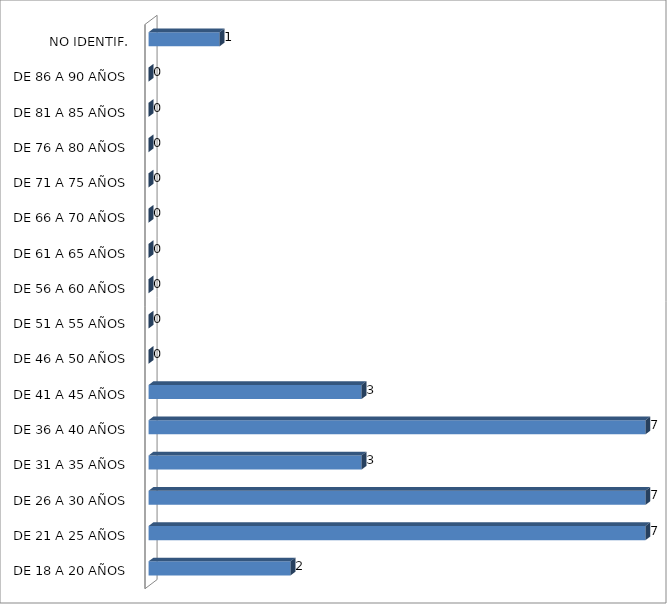
| Category | ESTADO  DE EBRIEDAD |
|---|---|
| DE 18 A 20 AÑOS | 2 |
| DE 21 A 25 AÑOS | 7 |
| DE 26 A 30 AÑOS | 7 |
| DE 31 A 35 AÑOS | 3 |
| DE 36 A 40 AÑOS | 7 |
| DE 41 A 45 AÑOS | 3 |
| DE 46 A 50 AÑOS | 0 |
| DE 51 A 55 AÑOS | 0 |
| DE 56 A 60 AÑOS | 0 |
| DE 61 A 65 AÑOS | 0 |
| DE 66 A 70 AÑOS | 0 |
| DE 71 A 75 AÑOS | 0 |
| DE 76 A 80 AÑOS | 0 |
| DE 81 A 85 AÑOS | 0 |
| DE 86 A 90 AÑOS | 0 |
| NO IDENTIF. | 1 |